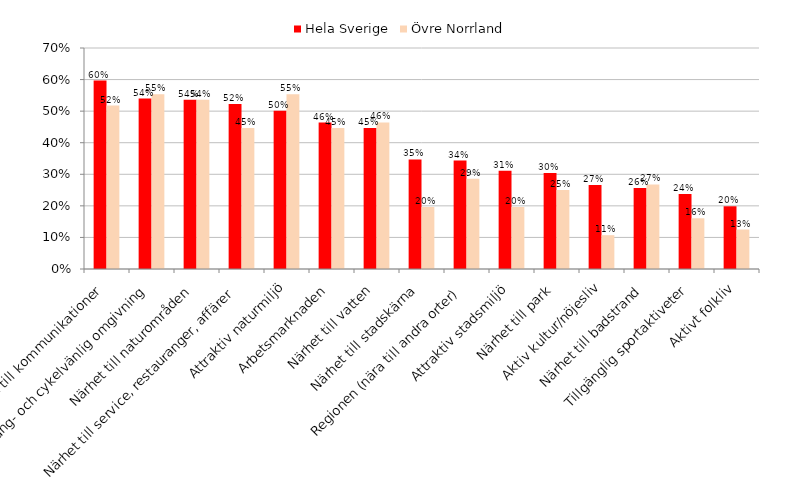
| Category | Hela Sverige | Övre Norrland |
|---|---|---|
| Närhet till kommunikationer | 0.597 | 0.518 |
| Gång- och cykelvänlig omgivning | 0.54 | 0.554 |
| Närhet till naturområden | 0.536 | 0.536 |
| Närhet till service, restauranger, affärer | 0.523 | 0.446 |
| Attraktiv naturmiljö | 0.501 | 0.554 |
| Arbetsmarknaden | 0.464 | 0.446 |
| Närhet till vatten | 0.446 | 0.464 |
| Närhet till stadskärna | 0.347 | 0.196 |
| Regionen (nära till andra orter) | 0.343 | 0.286 |
|  Attraktiv stadsmiljö | 0.311 | 0.196 |
| Närhet till park | 0.304 | 0.25 |
| Aktiv kultur/nöjesliv | 0.266 | 0.107 |
| Närhet till badstrand | 0.257 | 0.268 |
| Tillgänglig sportaktiveter | 0.237 | 0.161 |
| Aktivt folkliv | 0.199 | 0.125 |